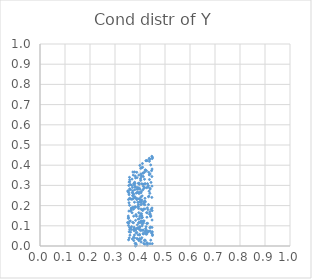
| Category | Series 0 |
|---|---|
| -100.0 | -100 |
| -100.0 | -100 |
| 0.3984788786961354 | 0.055 |
| -100.0 | -100 |
| -100.0 | -100 |
| -100.0 | -100 |
| -100.0 | -100 |
| -100.0 | -100 |
| -100.0 | -100 |
| -100.0 | -100 |
| -100.0 | -100 |
| -100.0 | -100 |
| -100.0 | -100 |
| -100.0 | -100 |
| -100.0 | -100 |
| -100.0 | -100 |
| -100.0 | -100 |
| -100.0 | -100 |
| 0.38183788734739155 | 0.291 |
| -100.0 | -100 |
| -100.0 | -100 |
| -100.0 | -100 |
| -100.0 | -100 |
| -100.0 | -100 |
| -100.0 | -100 |
| -100.0 | -100 |
| -100.0 | -100 |
| -100.0 | -100 |
| -100.0 | -100 |
| 0.44981181764780886 | 0.439 |
| -100.0 | -100 |
| -100.0 | -100 |
| -100.0 | -100 |
| -100.0 | -100 |
| -100.0 | -100 |
| -100.0 | -100 |
| -100.0 | -100 |
| -100.0 | -100 |
| -100.0 | -100 |
| -100.0 | -100 |
| -100.0 | -100 |
| -100.0 | -100 |
| -100.0 | -100 |
| -100.0 | -100 |
| -100.0 | -100 |
| -100.0 | -100 |
| -100.0 | -100 |
| -100.0 | -100 |
| -100.0 | -100 |
| -100.0 | -100 |
| -100.0 | -100 |
| -100.0 | -100 |
| -100.0 | -100 |
| -100.0 | -100 |
| -100.0 | -100 |
| -100.0 | -100 |
| -100.0 | -100 |
| 0.3764222153094099 | 0.092 |
| -100.0 | -100 |
| 0.43538564906960464 | 0.247 |
| -100.0 | -100 |
| -100.0 | -100 |
| -100.0 | -100 |
| 0.3986104908175241 | 0.265 |
| -100.0 | -100 |
| 0.42934469417904586 | 0.164 |
| -100.0 | -100 |
| -100.0 | -100 |
| -100.0 | -100 |
| -100.0 | -100 |
| -100.0 | -100 |
| -100.0 | -100 |
| -100.0 | -100 |
| -100.0 | -100 |
| -100.0 | -100 |
| -100.0 | -100 |
| -100.0 | -100 |
| -100.0 | -100 |
| -100.0 | -100 |
| -100.0 | -100 |
| -100.0 | -100 |
| -100.0 | -100 |
| -100.0 | -100 |
| 0.43119849776570507 | 0.012 |
| -100.0 | -100 |
| -100.0 | -100 |
| -100.0 | -100 |
| -100.0 | -100 |
| -100.0 | -100 |
| 0.4130955512670461 | 0.06 |
| -100.0 | -100 |
| -100.0 | -100 |
| -100.0 | -100 |
| 0.39761539218402175 | 0.136 |
| -100.0 | -100 |
| -100.0 | -100 |
| -100.0 | -100 |
| -100.0 | -100 |
| -100.0 | -100 |
| 0.37852267365319336 | 0.366 |
| -100.0 | -100 |
| -100.0 | -100 |
| -100.0 | -100 |
| -100.0 | -100 |
| -100.0 | -100 |
| -100.0 | -100 |
| -100.0 | -100 |
| -100.0 | -100 |
| -100.0 | -100 |
| -100.0 | -100 |
| -100.0 | -100 |
| -100.0 | -100 |
| 0.42733392534526826 | 0.017 |
| -100.0 | -100 |
| 0.35342719909961395 | 0.137 |
| -100.0 | -100 |
| -100.0 | -100 |
| -100.0 | -100 |
| -100.0 | -100 |
| -100.0 | -100 |
| 0.35132920341745844 | 0.273 |
| 0.3819134903836072 | 0.079 |
| -100.0 | -100 |
| -100.0 | -100 |
| -100.0 | -100 |
| -100.0 | -100 |
| 0.4040282498048947 | 0.264 |
| -100.0 | -100 |
| -100.0 | -100 |
| -100.0 | -100 |
| -100.0 | -100 |
| 0.4182765924295724 | 0.366 |
| -100.0 | -100 |
| -100.0 | -100 |
| -100.0 | -100 |
| -100.0 | -100 |
| -100.0 | -100 |
| 0.3611555429300717 | 0.124 |
| -100.0 | -100 |
| -100.0 | -100 |
| -100.0 | -100 |
| -100.0 | -100 |
| -100.0 | -100 |
| -100.0 | -100 |
| -100.0 | -100 |
| 0.4192288915169152 | 0.009 |
| -100.0 | -100 |
| 0.36732892085977253 | 0.231 |
| -100.0 | -100 |
| -100.0 | -100 |
| 0.4333009480636858 | 0.299 |
| -100.0 | -100 |
| -100.0 | -100 |
| 0.38901179366630356 | 0.088 |
| -100.0 | -100 |
| -100.0 | -100 |
| -100.0 | -100 |
| -100.0 | -100 |
| -100.0 | -100 |
| -100.0 | -100 |
| -100.0 | -100 |
| 0.3822358598220085 | 0.337 |
| -100.0 | -100 |
| -100.0 | -100 |
| -100.0 | -100 |
| -100.0 | -100 |
| -100.0 | -100 |
| -100.0 | -100 |
| -100.0 | -100 |
| -100.0 | -100 |
| -100.0 | -100 |
| -100.0 | -100 |
| -100.0 | -100 |
| -100.0 | -100 |
| -100.0 | -100 |
| 0.4058019486643727 | 0.35 |
| -100.0 | -100 |
| -100.0 | -100 |
| -100.0 | -100 |
| -100.0 | -100 |
| -100.0 | -100 |
| -100.0 | -100 |
| -100.0 | -100 |
| -100.0 | -100 |
| -100.0 | -100 |
| -100.0 | -100 |
| -100.0 | -100 |
| 0.42042175091712386 | 0.376 |
| -100.0 | -100 |
| -100.0 | -100 |
| -100.0 | -100 |
| -100.0 | -100 |
| -100.0 | -100 |
| -100.0 | -100 |
| -100.0 | -100 |
| -100.0 | -100 |
| -100.0 | -100 |
| -100.0 | -100 |
| -100.0 | -100 |
| -100.0 | -100 |
| -100.0 | -100 |
| 0.4025875365166094 | 0.159 |
| -100.0 | -100 |
| -100.0 | -100 |
| -100.0 | -100 |
| 0.4194444494610209 | 0.204 |
| -100.0 | -100 |
| -100.0 | -100 |
| -100.0 | -100 |
| -100.0 | -100 |
| -100.0 | -100 |
| -100.0 | -100 |
| -100.0 | -100 |
| -100.0 | -100 |
| -100.0 | -100 |
| -100.0 | -100 |
| 0.4299523964220757 | 0.308 |
| -100.0 | -100 |
| -100.0 | -100 |
| -100.0 | -100 |
| -100.0 | -100 |
| -100.0 | -100 |
| -100.0 | -100 |
| -100.0 | -100 |
| 0.39345051176621704 | 0.205 |
| -100.0 | -100 |
| -100.0 | -100 |
| -100.0 | -100 |
| -100.0 | -100 |
| 0.40488263397348767 | 0.02 |
| -100.0 | -100 |
| -100.0 | -100 |
| -100.0 | -100 |
| -100.0 | -100 |
| -100.0 | -100 |
| -100.0 | -100 |
| -100.0 | -100 |
| -100.0 | -100 |
| 0.3855236015125614 | 0.262 |
| -100.0 | -100 |
| 0.37402754642486036 | 0.182 |
| -100.0 | -100 |
| -100.0 | -100 |
| -100.0 | -100 |
| 0.43310127608439375 | 0.07 |
| -100.0 | -100 |
| -100.0 | -100 |
| -100.0 | -100 |
| -100.0 | -100 |
| -100.0 | -100 |
| -100.0 | -100 |
| -100.0 | -100 |
| 0.440050142944034 | 0.012 |
| -100.0 | -100 |
| -100.0 | -100 |
| 0.36457062461364764 | 0.178 |
| -100.0 | -100 |
| -100.0 | -100 |
| -100.0 | -100 |
| -100.0 | -100 |
| -100.0 | -100 |
| 0.4362612445817946 | 0.271 |
| 0.3811538403983896 | 0.293 |
| -100.0 | -100 |
| -100.0 | -100 |
| -100.0 | -100 |
| -100.0 | -100 |
| 0.4086707386680841 | 0.248 |
| -100.0 | -100 |
| -100.0 | -100 |
| 0.40260852835461924 | 0.117 |
| -100.0 | -100 |
| -100.0 | -100 |
| -100.0 | -100 |
| -100.0 | -100 |
| -100.0 | -100 |
| -100.0 | -100 |
| -100.0 | -100 |
| -100.0 | -100 |
| -100.0 | -100 |
| -100.0 | -100 |
| -100.0 | -100 |
| 0.3876938347231472 | 0.037 |
| -100.0 | -100 |
| -100.0 | -100 |
| -100.0 | -100 |
| -100.0 | -100 |
| -100.0 | -100 |
| -100.0 | -100 |
| -100.0 | -100 |
| -100.0 | -100 |
| -100.0 | -100 |
| -100.0 | -100 |
| -100.0 | -100 |
| -100.0 | -100 |
| -100.0 | -100 |
| -100.0 | -100 |
| -100.0 | -100 |
| -100.0 | -100 |
| -100.0 | -100 |
| -100.0 | -100 |
| -100.0 | -100 |
| -100.0 | -100 |
| -100.0 | -100 |
| -100.0 | -100 |
| -100.0 | -100 |
| -100.0 | -100 |
| -100.0 | -100 |
| -100.0 | -100 |
| -100.0 | -100 |
| -100.0 | -100 |
| 0.4051011178396613 | 0.27 |
| -100.0 | -100 |
| -100.0 | -100 |
| -100.0 | -100 |
| -100.0 | -100 |
| -100.0 | -100 |
| -100.0 | -100 |
| -100.0 | -100 |
| -100.0 | -100 |
| -100.0 | -100 |
| -100.0 | -100 |
| -100.0 | -100 |
| -100.0 | -100 |
| -100.0 | -100 |
| -100.0 | -100 |
| -100.0 | -100 |
| -100.0 | -100 |
| 0.44135163790208554 | 0.158 |
| -100.0 | -100 |
| -100.0 | -100 |
| -100.0 | -100 |
| 0.3539405311824003 | 0.23 |
| -100.0 | -100 |
| -100.0 | -100 |
| -100.0 | -100 |
| -100.0 | -100 |
| -100.0 | -100 |
| -100.0 | -100 |
| -100.0 | -100 |
| -100.0 | -100 |
| -100.0 | -100 |
| -100.0 | -100 |
| -100.0 | -100 |
| 0.42930797773132146 | 0.189 |
| 0.37649560663048376 | 0.076 |
| -100.0 | -100 |
| -100.0 | -100 |
| -100.0 | -100 |
| -100.0 | -100 |
| -100.0 | -100 |
| -100.0 | -100 |
| -100.0 | -100 |
| 0.37954052763918833 | 0.244 |
| -100.0 | -100 |
| -100.0 | -100 |
| -100.0 | -100 |
| -100.0 | -100 |
| -100.0 | -100 |
| -100.0 | -100 |
| -100.0 | -100 |
| -100.0 | -100 |
| -100.0 | -100 |
| -100.0 | -100 |
| -100.0 | -100 |
| -100.0 | -100 |
| -100.0 | -100 |
| -100.0 | -100 |
| 0.44043231415435946 | 0.356 |
| -100.0 | -100 |
| -100.0 | -100 |
| -100.0 | -100 |
| -100.0 | -100 |
| -100.0 | -100 |
| 0.4383119960336511 | 0.157 |
| -100.0 | -100 |
| -100.0 | -100 |
| -100.0 | -100 |
| 0.4115910105710997 | 0.077 |
| -100.0 | -100 |
| -100.0 | -100 |
| -100.0 | -100 |
| -100.0 | -100 |
| -100.0 | -100 |
| -100.0 | -100 |
| -100.0 | -100 |
| 0.39816789398510233 | 0.233 |
| -100.0 | -100 |
| -100.0 | -100 |
| -100.0 | -100 |
| -100.0 | -100 |
| -100.0 | -100 |
| -100.0 | -100 |
| -100.0 | -100 |
| -100.0 | -100 |
| -100.0 | -100 |
| -100.0 | -100 |
| -100.0 | -100 |
| -100.0 | -100 |
| -100.0 | -100 |
| -100.0 | -100 |
| -100.0 | -100 |
| 0.3945240547652642 | 0.115 |
| -100.0 | -100 |
| -100.0 | -100 |
| -100.0 | -100 |
| -100.0 | -100 |
| -100.0 | -100 |
| 0.419542626368824 | 0.069 |
| -100.0 | -100 |
| -100.0 | -100 |
| -100.0 | -100 |
| -100.0 | -100 |
| -100.0 | -100 |
| -100.0 | -100 |
| -100.0 | -100 |
| -100.0 | -100 |
| -100.0 | -100 |
| -100.0 | -100 |
| -100.0 | -100 |
| -100.0 | -100 |
| -100.0 | -100 |
| -100.0 | -100 |
| -100.0 | -100 |
| -100.0 | -100 |
| -100.0 | -100 |
| -100.0 | -100 |
| -100.0 | -100 |
| -100.0 | -100 |
| -100.0 | -100 |
| -100.0 | -100 |
| -100.0 | -100 |
| -100.0 | -100 |
| -100.0 | -100 |
| -100.0 | -100 |
| -100.0 | -100 |
| -100.0 | -100 |
| -100.0 | -100 |
| -100.0 | -100 |
| -100.0 | -100 |
| 0.39584914282997885 | 0.234 |
| -100.0 | -100 |
| -100.0 | -100 |
| -100.0 | -100 |
| -100.0 | -100 |
| -100.0 | -100 |
| 0.38046956036724167 | 0.013 |
| -100.0 | -100 |
| -100.0 | -100 |
| -100.0 | -100 |
| -100.0 | -100 |
| -100.0 | -100 |
| -100.0 | -100 |
| -100.0 | -100 |
| -100.0 | -100 |
| 0.3966693705280685 | 0.117 |
| -100.0 | -100 |
| -100.0 | -100 |
| -100.0 | -100 |
| 0.3557229659405544 | 0.262 |
| -100.0 | -100 |
| -100.0 | -100 |
| -100.0 | -100 |
| -100.0 | -100 |
| -100.0 | -100 |
| -100.0 | -100 |
| -100.0 | -100 |
| 0.3531137837585957 | 0.148 |
| -100.0 | -100 |
| 0.4096356634086432 | 0.408 |
| -100.0 | -100 |
| -100.0 | -100 |
| -100.0 | -100 |
| -100.0 | -100 |
| -100.0 | -100 |
| -100.0 | -100 |
| -100.0 | -100 |
| -100.0 | -100 |
| -100.0 | -100 |
| -100.0 | -100 |
| -100.0 | -100 |
| -100.0 | -100 |
| 0.4499613863519254 | 0.057 |
| -100.0 | -100 |
| -100.0 | -100 |
| -100.0 | -100 |
| -100.0 | -100 |
| 0.41763707985634557 | 0.027 |
| -100.0 | -100 |
| -100.0 | -100 |
| -100.0 | -100 |
| 0.3543201400672933 | 0.031 |
| -100.0 | -100 |
| -100.0 | -100 |
| 0.3589610226025929 | 0.081 |
| -100.0 | -100 |
| -100.0 | -100 |
| -100.0 | -100 |
| -100.0 | -100 |
| -100.0 | -100 |
| -100.0 | -100 |
| -100.0 | -100 |
| -100.0 | -100 |
| -100.0 | -100 |
| 0.3872492360251891 | 0.365 |
| -100.0 | -100 |
| -100.0 | -100 |
| -100.0 | -100 |
| -100.0 | -100 |
| -100.0 | -100 |
| -100.0 | -100 |
| -100.0 | -100 |
| -100.0 | -100 |
| -100.0 | -100 |
| -100.0 | -100 |
| -100.0 | -100 |
| -100.0 | -100 |
| -100.0 | -100 |
| 0.4107633832123716 | 0.176 |
| -100.0 | -100 |
| -100.0 | -100 |
| -100.0 | -100 |
| 0.40739519582220307 | 0.041 |
| -100.0 | -100 |
| -100.0 | -100 |
| -100.0 | -100 |
| -100.0 | -100 |
| -100.0 | -100 |
| -100.0 | -100 |
| -100.0 | -100 |
| -100.0 | -100 |
| -100.0 | -100 |
| -100.0 | -100 |
| 0.36409236822058066 | 0.176 |
| -100.0 | -100 |
| -100.0 | -100 |
| 0.3548166404507386 | 0.112 |
| -100.0 | -100 |
| -100.0 | -100 |
| -100.0 | -100 |
| -100.0 | -100 |
| -100.0 | -100 |
| -100.0 | -100 |
| -100.0 | -100 |
| -100.0 | -100 |
| -100.0 | -100 |
| -100.0 | -100 |
| 0.40592103161428483 | 0.22 |
| -100.0 | -100 |
| -100.0 | -100 |
| -100.0 | -100 |
| -100.0 | -100 |
| -100.0 | -100 |
| -100.0 | -100 |
| -100.0 | -100 |
| -100.0 | -100 |
| -100.0 | -100 |
| -100.0 | -100 |
| 0.39526563132838244 | 0.351 |
| -100.0 | -100 |
| -100.0 | -100 |
| -100.0 | -100 |
| -100.0 | -100 |
| -100.0 | -100 |
| -100.0 | -100 |
| -100.0 | -100 |
| -100.0 | -100 |
| -100.0 | -100 |
| -100.0 | -100 |
| -100.0 | -100 |
| -100.0 | -100 |
| -100.0 | -100 |
| -100.0 | -100 |
| 0.35648639021604867 | 0.316 |
| -100.0 | -100 |
| 0.41627736120799985 | 0.124 |
| -100.0 | -100 |
| -100.0 | -100 |
| -100.0 | -100 |
| -100.0 | -100 |
| -100.0 | -100 |
| -100.0 | -100 |
| -100.0 | -100 |
| -100.0 | -100 |
| -100.0 | -100 |
| -100.0 | -100 |
| 0.3714442688569879 | 0.366 |
| 0.3567560020673838 | 0.07 |
| -100.0 | -100 |
| -100.0 | -100 |
| -100.0 | -100 |
| -100.0 | -100 |
| -100.0 | -100 |
| -100.0 | -100 |
| -100.0 | -100 |
| -100.0 | -100 |
| -100.0 | -100 |
| -100.0 | -100 |
| -100.0 | -100 |
| -100.0 | -100 |
| -100.0 | -100 |
| -100.0 | -100 |
| -100.0 | -100 |
| -100.0 | -100 |
| -100.0 | -100 |
| -100.0 | -100 |
| -100.0 | -100 |
| -100.0 | -100 |
| -100.0 | -100 |
| -100.0 | -100 |
| -100.0 | -100 |
| -100.0 | -100 |
| -100.0 | -100 |
| -100.0 | -100 |
| -100.0 | -100 |
| -100.0 | -100 |
| -100.0 | -100 |
| -100.0 | -100 |
| -100.0 | -100 |
| -100.0 | -100 |
| -100.0 | -100 |
| -100.0 | -100 |
| -100.0 | -100 |
| 0.415099911584044 | 0.013 |
| -100.0 | -100 |
| 0.4482151463092019 | 0.381 |
| -100.0 | -100 |
| -100.0 | -100 |
| -100.0 | -100 |
| -100.0 | -100 |
| -100.0 | -100 |
| -100.0 | -100 |
| -100.0 | -100 |
| 0.35837645761405423 | 0.236 |
| -100.0 | -100 |
| -100.0 | -100 |
| -100.0 | -100 |
| -100.0 | -100 |
| -100.0 | -100 |
| -100.0 | -100 |
| 0.41428141133515495 | 0.208 |
| -100.0 | -100 |
| -100.0 | -100 |
| -100.0 | -100 |
| -100.0 | -100 |
| -100.0 | -100 |
| 0.37536282309945157 | 0.257 |
| -100.0 | -100 |
| -100.0 | -100 |
| -100.0 | -100 |
| -100.0 | -100 |
| -100.0 | -100 |
| 0.35914195601693033 | 0.284 |
| -100.0 | -100 |
| -100.0 | -100 |
| -100.0 | -100 |
| 0.42600881845304384 | 0.372 |
| -100.0 | -100 |
| 0.439533195655169 | 0.285 |
| -100.0 | -100 |
| -100.0 | -100 |
| -100.0 | -100 |
| -100.0 | -100 |
| -100.0 | -100 |
| -100.0 | -100 |
| -100.0 | -100 |
| -100.0 | -100 |
| -100.0 | -100 |
| -100.0 | -100 |
| -100.0 | -100 |
| -100.0 | -100 |
| -100.0 | -100 |
| -100.0 | -100 |
| -100.0 | -100 |
| -100.0 | -100 |
| -100.0 | -100 |
| -100.0 | -100 |
| -100.0 | -100 |
| 0.447552998036823 | 0.344 |
| -100.0 | -100 |
| -100.0 | -100 |
| 0.35834015206539627 | 0.123 |
| -100.0 | -100 |
| -100.0 | -100 |
| -100.0 | -100 |
| 0.3621487687972339 | 0.174 |
| -100.0 | -100 |
| -100.0 | -100 |
| -100.0 | -100 |
| -100.0 | -100 |
| 0.38601340774203186 | 0.147 |
| -100.0 | -100 |
| -100.0 | -100 |
| 0.44912752240569254 | 0.433 |
| -100.0 | -100 |
| -100.0 | -100 |
| -100.0 | -100 |
| -100.0 | -100 |
| -100.0 | -100 |
| -100.0 | -100 |
| 0.38121842330434963 | 0.347 |
| -100.0 | -100 |
| -100.0 | -100 |
| -100.0 | -100 |
| -100.0 | -100 |
| -100.0 | -100 |
| -100.0 | -100 |
| -100.0 | -100 |
| -100.0 | -100 |
| -100.0 | -100 |
| -100.0 | -100 |
| -100.0 | -100 |
| -100.0 | -100 |
| -100.0 | -100 |
| -100.0 | -100 |
| -100.0 | -100 |
| -100.0 | -100 |
| -100.0 | -100 |
| -100.0 | -100 |
| 0.3881133514652916 | 0.264 |
| -100.0 | -100 |
| -100.0 | -100 |
| 0.4481050547569533 | 0.092 |
| -100.0 | -100 |
| -100.0 | -100 |
| -100.0 | -100 |
| -100.0 | -100 |
| -100.0 | -100 |
| -100.0 | -100 |
| 0.4489242780853723 | 0.012 |
| -100.0 | -100 |
| -100.0 | -100 |
| 0.3750154381992795 | 0.31 |
| 0.3587700878064274 | 0.328 |
| 0.3807962904367137 | 0.194 |
| -100.0 | -100 |
| -100.0 | -100 |
| -100.0 | -100 |
| -100.0 | -100 |
| -100.0 | -100 |
| -100.0 | -100 |
| 0.354305491066531 | 0.274 |
| -100.0 | -100 |
| -100.0 | -100 |
| -100.0 | -100 |
| -100.0 | -100 |
| -100.0 | -100 |
| -100.0 | -100 |
| -100.0 | -100 |
| -100.0 | -100 |
| 0.3680855988617132 | 0.331 |
| -100.0 | -100 |
| -100.0 | -100 |
| -100.0 | -100 |
| -100.0 | -100 |
| -100.0 | -100 |
| -100.0 | -100 |
| -100.0 | -100 |
| -100.0 | -100 |
| -100.0 | -100 |
| -100.0 | -100 |
| -100.0 | -100 |
| -100.0 | -100 |
| -100.0 | -100 |
| -100.0 | -100 |
| 0.4113973920932219 | 0.123 |
| -100.0 | -100 |
| -100.0 | -100 |
| -100.0 | -100 |
| 0.35033903251277676 | 0.116 |
| 0.36484288358911776 | 0.187 |
| -100.0 | -100 |
| -100.0 | -100 |
| -100.0 | -100 |
| -100.0 | -100 |
| -100.0 | -100 |
| -100.0 | -100 |
| -100.0 | -100 |
| -100.0 | -100 |
| -100.0 | -100 |
| -100.0 | -100 |
| 0.4269250243439454 | 0.112 |
| -100.0 | -100 |
| -100.0 | -100 |
| -100.0 | -100 |
| -100.0 | -100 |
| -100.0 | -100 |
| -100.0 | -100 |
| -100.0 | -100 |
| 0.4480010338520881 | 0.188 |
| -100.0 | -100 |
| -100.0 | -100 |
| -100.0 | -100 |
| -100.0 | -100 |
| -100.0 | -100 |
| -100.0 | -100 |
| -100.0 | -100 |
| -100.0 | -100 |
| -100.0 | -100 |
| -100.0 | -100 |
| -100.0 | -100 |
| -100.0 | -100 |
| 0.39597897920913483 | 0.26 |
| -100.0 | -100 |
| -100.0 | -100 |
| -100.0 | -100 |
| -100.0 | -100 |
| -100.0 | -100 |
| -100.0 | -100 |
| -100.0 | -100 |
| -100.0 | -100 |
| -100.0 | -100 |
| -100.0 | -100 |
| -100.0 | -100 |
| -100.0 | -100 |
| -100.0 | -100 |
| -100.0 | -100 |
| -100.0 | -100 |
| -100.0 | -100 |
| -100.0 | -100 |
| -100.0 | -100 |
| -100.0 | -100 |
| -100.0 | -100 |
| -100.0 | -100 |
| -100.0 | -100 |
| -100.0 | -100 |
| -100.0 | -100 |
| -100.0 | -100 |
| -100.0 | -100 |
| -100.0 | -100 |
| -100.0 | -100 |
| -100.0 | -100 |
| -100.0 | -100 |
| -100.0 | -100 |
| -100.0 | -100 |
| -100.0 | -100 |
| -100.0 | -100 |
| -100.0 | -100 |
| -100.0 | -100 |
| -100.0 | -100 |
| -100.0 | -100 |
| -100.0 | -100 |
| -100.0 | -100 |
| -100.0 | -100 |
| -100.0 | -100 |
| -100.0 | -100 |
| -100.0 | -100 |
| -100.0 | -100 |
| -100.0 | -100 |
| -100.0 | -100 |
| -100.0 | -100 |
| 0.35505058509651166 | 0.299 |
| -100.0 | -100 |
| -100.0 | -100 |
| -100.0 | -100 |
| -100.0 | -100 |
| -100.0 | -100 |
| -100.0 | -100 |
| -100.0 | -100 |
| -100.0 | -100 |
| -100.0 | -100 |
| -100.0 | -100 |
| -100.0 | -100 |
| 0.3628860077193099 | 0.089 |
| 0.3709855242475689 | 0.25 |
| 0.37795238958678146 | 0.191 |
| 0.4315313368541588 | 0.18 |
| -100.0 | -100 |
| -100.0 | -100 |
| -100.0 | -100 |
| -100.0 | -100 |
| -100.0 | -100 |
| 0.4076828116360486 | 0.118 |
| -100.0 | -100 |
| -100.0 | -100 |
| -100.0 | -100 |
| -100.0 | -100 |
| 0.40448122931332287 | 0.183 |
| -100.0 | -100 |
| -100.0 | -100 |
| -100.0 | -100 |
| -100.0 | -100 |
| -100.0 | -100 |
| -100.0 | -100 |
| 0.3815043384819179 | 0.001 |
| -100.0 | -100 |
| -100.0 | -100 |
| -100.0 | -100 |
| -100.0 | -100 |
| -100.0 | -100 |
| -100.0 | -100 |
| -100.0 | -100 |
| -100.0 | -100 |
| -100.0 | -100 |
| -100.0 | -100 |
| -100.0 | -100 |
| -100.0 | -100 |
| 0.44316723318466344 | 0.029 |
| -100.0 | -100 |
| -100.0 | -100 |
| -100.0 | -100 |
| -100.0 | -100 |
| -100.0 | -100 |
| 0.4145766489600815 | 0.183 |
| -100.0 | -100 |
| -100.0 | -100 |
| -100.0 | -100 |
| -100.0 | -100 |
| -100.0 | -100 |
| -100.0 | -100 |
| -100.0 | -100 |
| -100.0 | -100 |
| -100.0 | -100 |
| -100.0 | -100 |
| 0.3538702726611439 | 0.102 |
| -100.0 | -100 |
| -100.0 | -100 |
| -100.0 | -100 |
| -100.0 | -100 |
| -100.0 | -100 |
| -100.0 | -100 |
| -100.0 | -100 |
| -100.0 | -100 |
| -100.0 | -100 |
| -100.0 | -100 |
| -100.0 | -100 |
| -100.0 | -100 |
| -100.0 | -100 |
| -100.0 | -100 |
| -100.0 | -100 |
| -100.0 | -100 |
| -100.0 | -100 |
| -100.0 | -100 |
| -100.0 | -100 |
| -100.0 | -100 |
| -100.0 | -100 |
| 0.42543800229766815 | 0.422 |
| -100.0 | -100 |
| -100.0 | -100 |
| -100.0 | -100 |
| -100.0 | -100 |
| -100.0 | -100 |
| -100.0 | -100 |
| -100.0 | -100 |
| -100.0 | -100 |
| -100.0 | -100 |
| -100.0 | -100 |
| -100.0 | -100 |
| -100.0 | -100 |
| -100.0 | -100 |
| -100.0 | -100 |
| -100.0 | -100 |
| -100.0 | -100 |
| -100.0 | -100 |
| -100.0 | -100 |
| -100.0 | -100 |
| -100.0 | -100 |
| -100.0 | -100 |
| -100.0 | -100 |
| -100.0 | -100 |
| -100.0 | -100 |
| -100.0 | -100 |
| -100.0 | -100 |
| 0.36115369142999965 | 0.304 |
| -100.0 | -100 |
| -100.0 | -100 |
| -100.0 | -100 |
| -100.0 | -100 |
| -100.0 | -100 |
| -100.0 | -100 |
| -100.0 | -100 |
| -100.0 | -100 |
| -100.0 | -100 |
| -100.0 | -100 |
| -100.0 | -100 |
| -100.0 | -100 |
| -100.0 | -100 |
| -100.0 | -100 |
| -100.0 | -100 |
| -100.0 | -100 |
| -100.0 | -100 |
| -100.0 | -100 |
| -100.0 | -100 |
| -100.0 | -100 |
| -100.0 | -100 |
| -100.0 | -100 |
| -100.0 | -100 |
| -100.0 | -100 |
| -100.0 | -100 |
| -100.0 | -100 |
| 0.4020128651556827 | 0.333 |
| -100.0 | -100 |
| -100.0 | -100 |
| -100.0 | -100 |
| -100.0 | -100 |
| -100.0 | -100 |
| 0.41328383212127706 | 0.344 |
| -100.0 | -100 |
| -100.0 | -100 |
| -100.0 | -100 |
| -100.0 | -100 |
| -100.0 | -100 |
| -100.0 | -100 |
| -100.0 | -100 |
| -100.0 | -100 |
| -100.0 | -100 |
| -100.0 | -100 |
| 0.3683324548639334 | 0.165 |
| -100.0 | -100 |
| -100.0 | -100 |
| -100.0 | -100 |
| -100.0 | -100 |
| -100.0 | -100 |
| -100.0 | -100 |
| -100.0 | -100 |
| -100.0 | -100 |
| -100.0 | -100 |
| -100.0 | -100 |
| -100.0 | -100 |
| 0.419397314221565 | 0.184 |
| 0.3980071701273502 | 0.095 |
| 0.378231411539917 | 0.04 |
| -100.0 | -100 |
| -100.0 | -100 |
| -100.0 | -100 |
| -100.0 | -100 |
| -100.0 | -100 |
| -100.0 | -100 |
| -100.0 | -100 |
| -100.0 | -100 |
| 0.40742928342665186 | 0.308 |
| -100.0 | -100 |
| -100.0 | -100 |
| -100.0 | -100 |
| -100.0 | -100 |
| -100.0 | -100 |
| -100.0 | -100 |
| -100.0 | -100 |
| 0.37032689640993466 | 0.29 |
| -100.0 | -100 |
| -100.0 | -100 |
| -100.0 | -100 |
| -100.0 | -100 |
| -100.0 | -100 |
| -100.0 | -100 |
| -100.0 | -100 |
| -100.0 | -100 |
| -100.0 | -100 |
| -100.0 | -100 |
| -100.0 | -100 |
| -100.0 | -100 |
| -100.0 | -100 |
| 0.3540866600449434 | 0.14 |
| -100.0 | -100 |
| 0.4213282639254168 | 0.028 |
| -100.0 | -100 |
| -100.0 | -100 |
| -100.0 | -100 |
| -100.0 | -100 |
| -100.0 | -100 |
| -100.0 | -100 |
| -100.0 | -100 |
| -100.0 | -100 |
| -100.0 | -100 |
| -100.0 | -100 |
| 0.39339475339041674 | 0.194 |
| -100.0 | -100 |
| -100.0 | -100 |
| -100.0 | -100 |
| -100.0 | -100 |
| -100.0 | -100 |
| -100.0 | -100 |
| -100.0 | -100 |
| -100.0 | -100 |
| -100.0 | -100 |
| -100.0 | -100 |
| -100.0 | -100 |
| -100.0 | -100 |
| -100.0 | -100 |
| -100.0 | -100 |
| -100.0 | -100 |
| 0.35869802011967844 | 0.318 |
| -100.0 | -100 |
| -100.0 | -100 |
| -100.0 | -100 |
| -100.0 | -100 |
| -100.0 | -100 |
| 0.3854388735498616 | 0.005 |
| -100.0 | -100 |
| -100.0 | -100 |
| -100.0 | -100 |
| -100.0 | -100 |
| -100.0 | -100 |
| -100.0 | -100 |
| -100.0 | -100 |
| -100.0 | -100 |
| -100.0 | -100 |
| -100.0 | -100 |
| -100.0 | -100 |
| 0.37767936900250554 | 0.088 |
| -100.0 | -100 |
| -100.0 | -100 |
| -100.0 | -100 |
| -100.0 | -100 |
| -100.0 | -100 |
| -100.0 | -100 |
| -100.0 | -100 |
| -100.0 | -100 |
| -100.0 | -100 |
| -100.0 | -100 |
| -100.0 | -100 |
| -100.0 | -100 |
| -100.0 | -100 |
| -100.0 | -100 |
| -100.0 | -100 |
| -100.0 | -100 |
| 0.3928332606375248 | 0.197 |
| -100.0 | -100 |
| -100.0 | -100 |
| 0.41805832259307085 | 0.331 |
| -100.0 | -100 |
| -100.0 | -100 |
| -100.0 | -100 |
| -100.0 | -100 |
| -100.0 | -100 |
| -100.0 | -100 |
| -100.0 | -100 |
| -100.0 | -100 |
| 0.3710857534269848 | 0.248 |
| -100.0 | -100 |
| 0.4407981805223331 | 0.282 |
| -100.0 | -100 |
| -100.0 | -100 |
| -100.0 | -100 |
| -100.0 | -100 |
| -100.0 | -100 |
| -100.0 | -100 |
| 0.3597261948462247 | 0.054 |
| -100.0 | -100 |
| -100.0 | -100 |
| -100.0 | -100 |
| -100.0 | -100 |
| 0.39666586968639694 | 0.311 |
| -100.0 | -100 |
| -100.0 | -100 |
| -100.0 | -100 |
| -100.0 | -100 |
| -100.0 | -100 |
| -100.0 | -100 |
| -100.0 | -100 |
| -100.0 | -100 |
| -100.0 | -100 |
| -100.0 | -100 |
| -100.0 | -100 |
| 0.4265588734516407 | 0.058 |
| -100.0 | -100 |
| -100.0 | -100 |
| -100.0 | -100 |
| -100.0 | -100 |
| -100.0 | -100 |
| -100.0 | -100 |
| -100.0 | -100 |
| -100.0 | -100 |
| -100.0 | -100 |
| -100.0 | -100 |
| -100.0 | -100 |
| 0.37320751638410377 | 0.351 |
| -100.0 | -100 |
| -100.0 | -100 |
| -100.0 | -100 |
| -100.0 | -100 |
| -100.0 | -100 |
| -100.0 | -100 |
| -100.0 | -100 |
| -100.0 | -100 |
| -100.0 | -100 |
| 0.43946291534993087 | 0.261 |
| -100.0 | -100 |
| -100.0 | -100 |
| -100.0 | -100 |
| -100.0 | -100 |
| -100.0 | -100 |
| 0.3570258626496131 | 0.04 |
| -100.0 | -100 |
| -100.0 | -100 |
| -100.0 | -100 |
| -100.0 | -100 |
| -100.0 | -100 |
| -100.0 | -100 |
| -100.0 | -100 |
| -100.0 | -100 |
| -100.0 | -100 |
| -100.0 | -100 |
| -100.0 | -100 |
| -100.0 | -100 |
| -100.0 | -100 |
| -100.0 | -100 |
| -100.0 | -100 |
| -100.0 | -100 |
| 0.41892426215282497 | 0.029 |
| -100.0 | -100 |
| 0.3664169758313296 | 0.082 |
| -100.0 | -100 |
| -100.0 | -100 |
| -100.0 | -100 |
| -100.0 | -100 |
| -100.0 | -100 |
| -100.0 | -100 |
| -100.0 | -100 |
| -100.0 | -100 |
| -100.0 | -100 |
| -100.0 | -100 |
| -100.0 | -100 |
| -100.0 | -100 |
| -100.0 | -100 |
| -100.0 | -100 |
| -100.0 | -100 |
| -100.0 | -100 |
| -100.0 | -100 |
| -100.0 | -100 |
| -100.0 | -100 |
| -100.0 | -100 |
| -100.0 | -100 |
| -100.0 | -100 |
| -100.0 | -100 |
| -100.0 | -100 |
| 0.37791563953387275 | 0.217 |
| -100.0 | -100 |
| -100.0 | -100 |
| -100.0 | -100 |
| -100.0 | -100 |
| -100.0 | -100 |
| -100.0 | -100 |
| -100.0 | -100 |
| 0.4474044355289639 | 0.24 |
| -100.0 | -100 |
| -100.0 | -100 |
| -100.0 | -100 |
| -100.0 | -100 |
| -100.0 | -100 |
| -100.0 | -100 |
| -100.0 | -100 |
| -100.0 | -100 |
| -100.0 | -100 |
| -100.0 | -100 |
| -100.0 | -100 |
| -100.0 | -100 |
| 0.44373838082620265 | 0.148 |
| -100.0 | -100 |
| -100.0 | -100 |
| -100.0 | -100 |
| -100.0 | -100 |
| -100.0 | -100 |
| -100.0 | -100 |
| -100.0 | -100 |
| -100.0 | -100 |
| -100.0 | -100 |
| -100.0 | -100 |
| -100.0 | -100 |
| 0.4071864750345332 | 0.228 |
| 0.3714790747942155 | 0.191 |
| -100.0 | -100 |
| -100.0 | -100 |
| -100.0 | -100 |
| -100.0 | -100 |
| -100.0 | -100 |
| -100.0 | -100 |
| 0.39876923552627075 | 0.148 |
| 0.43750868205724835 | 0.419 |
| -100.0 | -100 |
| -100.0 | -100 |
| -100.0 | -100 |
| -100.0 | -100 |
| -100.0 | -100 |
| -100.0 | -100 |
| -100.0 | -100 |
| -100.0 | -100 |
| -100.0 | -100 |
| -100.0 | -100 |
| -100.0 | -100 |
| -100.0 | -100 |
| -100.0 | -100 |
| -100.0 | -100 |
| -100.0 | -100 |
| -100.0 | -100 |
| 0.3705074533904743 | 0.117 |
| -100.0 | -100 |
| -100.0 | -100 |
| -100.0 | -100 |
| -100.0 | -100 |
| -100.0 | -100 |
| -100.0 | -100 |
| -100.0 | -100 |
| -100.0 | -100 |
| -100.0 | -100 |
| -100.0 | -100 |
| -100.0 | -100 |
| -100.0 | -100 |
| -100.0 | -100 |
| -100.0 | -100 |
| -100.0 | -100 |
| -100.0 | -100 |
| -100.0 | -100 |
| -100.0 | -100 |
| -100.0 | -100 |
| -100.0 | -100 |
| -100.0 | -100 |
| -100.0 | -100 |
| -100.0 | -100 |
| -100.0 | -100 |
| 0.4213940858952344 | 0.308 |
| -100.0 | -100 |
| -100.0 | -100 |
| -100.0 | -100 |
| -100.0 | -100 |
| -100.0 | -100 |
| -100.0 | -100 |
| -100.0 | -100 |
| -100.0 | -100 |
| -100.0 | -100 |
| -100.0 | -100 |
| -100.0 | -100 |
| -100.0 | -100 |
| -100.0 | -100 |
| 0.3797899942750387 | 0.309 |
| 0.375711535596277 | 0.082 |
| -100.0 | -100 |
| -100.0 | -100 |
| -100.0 | -100 |
| -100.0 | -100 |
| -100.0 | -100 |
| -100.0 | -100 |
| -100.0 | -100 |
| -100.0 | -100 |
| -100.0 | -100 |
| -100.0 | -100 |
| -100.0 | -100 |
| -100.0 | -100 |
| -100.0 | -100 |
| -100.0 | -100 |
| -100.0 | -100 |
| -100.0 | -100 |
| -100.0 | -100 |
| -100.0 | -100 |
| -100.0 | -100 |
| -100.0 | -100 |
| -100.0 | -100 |
| -100.0 | -100 |
| -100.0 | -100 |
| -100.0 | -100 |
| -100.0 | -100 |
| -100.0 | -100 |
| -100.0 | -100 |
| -100.0 | -100 |
| -100.0 | -100 |
| -100.0 | -100 |
| 0.41294707110089524 | 0.361 |
| -100.0 | -100 |
| -100.0 | -100 |
| -100.0 | -100 |
| -100.0 | -100 |
| -100.0 | -100 |
| -100.0 | -100 |
| 0.37424648644370684 | 0.044 |
| -100.0 | -100 |
| -100.0 | -100 |
| -100.0 | -100 |
| -100.0 | -100 |
| -100.0 | -100 |
| -100.0 | -100 |
| -100.0 | -100 |
| -100.0 | -100 |
| -100.0 | -100 |
| -100.0 | -100 |
| -100.0 | -100 |
| -100.0 | -100 |
| -100.0 | -100 |
| -100.0 | -100 |
| -100.0 | -100 |
| -100.0 | -100 |
| -100.0 | -100 |
| -100.0 | -100 |
| -100.0 | -100 |
| 0.36891390237217947 | 0.264 |
| -100.0 | -100 |
| -100.0 | -100 |
| -100.0 | -100 |
| -100.0 | -100 |
| 0.39141273094356965 | 0.266 |
| -100.0 | -100 |
| -100.0 | -100 |
| -100.0 | -100 |
| -100.0 | -100 |
| -100.0 | -100 |
| -100.0 | -100 |
| -100.0 | -100 |
| -100.0 | -100 |
| -100.0 | -100 |
| -100.0 | -100 |
| -100.0 | -100 |
| -100.0 | -100 |
| -100.0 | -100 |
| -100.0 | -100 |
| 0.42803227959532175 | 0.065 |
| -100.0 | -100 |
| -100.0 | -100 |
| -100.0 | -100 |
| -100.0 | -100 |
| -100.0 | -100 |
| -100.0 | -100 |
| -100.0 | -100 |
| -100.0 | -100 |
| 0.3909544470781362 | 0.216 |
| -100.0 | -100 |
| -100.0 | -100 |
| -100.0 | -100 |
| -100.0 | -100 |
| -100.0 | -100 |
| -100.0 | -100 |
| -100.0 | -100 |
| 0.3777709960550988 | 0.054 |
| -100.0 | -100 |
| -100.0 | -100 |
| -100.0 | -100 |
| -100.0 | -100 |
| -100.0 | -100 |
| -100.0 | -100 |
| -100.0 | -100 |
| -100.0 | -100 |
| -100.0 | -100 |
| -100.0 | -100 |
| -100.0 | -100 |
| -100.0 | -100 |
| -100.0 | -100 |
| -100.0 | -100 |
| -100.0 | -100 |
| -100.0 | -100 |
| -100.0 | -100 |
| -100.0 | -100 |
| -100.0 | -100 |
| -100.0 | -100 |
| -100.0 | -100 |
| -100.0 | -100 |
| -100.0 | -100 |
| -100.0 | -100 |
| -100.0 | -100 |
| 0.3666768095758818 | 0.301 |
| -100.0 | -100 |
| -100.0 | -100 |
| -100.0 | -100 |
| -100.0 | -100 |
| -100.0 | -100 |
| -100.0 | -100 |
| 0.4039731735352581 | 0.205 |
| -100.0 | -100 |
| -100.0 | -100 |
| -100.0 | -100 |
| -100.0 | -100 |
| -100.0 | -100 |
| -100.0 | -100 |
| -100.0 | -100 |
| -100.0 | -100 |
| -100.0 | -100 |
| 0.41390003483815974 | 0.114 |
| -100.0 | -100 |
| 0.35794012421603416 | 0.201 |
| -100.0 | -100 |
| -100.0 | -100 |
| -100.0 | -100 |
| -100.0 | -100 |
| -100.0 | -100 |
| -100.0 | -100 |
| -100.0 | -100 |
| -100.0 | -100 |
| -100.0 | -100 |
| -100.0 | -100 |
| -100.0 | -100 |
| -100.0 | -100 |
| -100.0 | -100 |
| 0.4134226499761373 | 0.124 |
| -100.0 | -100 |
| -100.0 | -100 |
| -100.0 | -100 |
| -100.0 | -100 |
| -100.0 | -100 |
| -100.0 | -100 |
| 0.3929773627920534 | 0.133 |
| -100.0 | -100 |
| -100.0 | -100 |
| -100.0 | -100 |
| -100.0 | -100 |
| 0.3846127819158909 | 0.065 |
| -100.0 | -100 |
| -100.0 | -100 |
| 0.4054378143694082 | 0.342 |
| -100.0 | -100 |
| -100.0 | -100 |
| 0.4386031259823473 | 0.43 |
| -100.0 | -100 |
| -100.0 | -100 |
| -100.0 | -100 |
| -100.0 | -100 |
| -100.0 | -100 |
| -100.0 | -100 |
| -100.0 | -100 |
| -100.0 | -100 |
| -100.0 | -100 |
| -100.0 | -100 |
| -100.0 | -100 |
| -100.0 | -100 |
| 0.37571302177019605 | 0.238 |
| -100.0 | -100 |
| 0.44888372770796214 | 0.071 |
| -100.0 | -100 |
| -100.0 | -100 |
| -100.0 | -100 |
| -100.0 | -100 |
| -100.0 | -100 |
| -100.0 | -100 |
| -100.0 | -100 |
| -100.0 | -100 |
| -100.0 | -100 |
| -100.0 | -100 |
| -100.0 | -100 |
| -100.0 | -100 |
| -100.0 | -100 |
| -100.0 | -100 |
| 0.39628167777514356 | 0.083 |
| -100.0 | -100 |
| -100.0 | -100 |
| -100.0 | -100 |
| -100.0 | -100 |
| -100.0 | -100 |
| 0.4428016271454457 | 0.401 |
| -100.0 | -100 |
| -100.0 | -100 |
| -100.0 | -100 |
| -100.0 | -100 |
| -100.0 | -100 |
| -100.0 | -100 |
| -100.0 | -100 |
| -100.0 | -100 |
| -100.0 | -100 |
| -100.0 | -100 |
| -100.0 | -100 |
| -100.0 | -100 |
| -100.0 | -100 |
| -100.0 | -100 |
| -100.0 | -100 |
| -100.0 | -100 |
| 0.396900537391478 | 0.306 |
| -100.0 | -100 |
| -100.0 | -100 |
| 0.4286722523684161 | 0.423 |
| -100.0 | -100 |
| -100.0 | -100 |
| -100.0 | -100 |
| -100.0 | -100 |
| -100.0 | -100 |
| -100.0 | -100 |
| -100.0 | -100 |
| -100.0 | -100 |
| -100.0 | -100 |
| -100.0 | -100 |
| -100.0 | -100 |
| -100.0 | -100 |
| -100.0 | -100 |
| -100.0 | -100 |
| -100.0 | -100 |
| -100.0 | -100 |
| -100.0 | -100 |
| -100.0 | -100 |
| -100.0 | -100 |
| -100.0 | -100 |
| -100.0 | -100 |
| -100.0 | -100 |
| -100.0 | -100 |
| -100.0 | -100 |
| -100.0 | -100 |
| -100.0 | -100 |
| -100.0 | -100 |
| -100.0 | -100 |
| -100.0 | -100 |
| -100.0 | -100 |
| -100.0 | -100 |
| -100.0 | -100 |
| -100.0 | -100 |
| -100.0 | -100 |
| -100.0 | -100 |
| -100.0 | -100 |
| 0.4219267049135079 | 0.377 |
| -100.0 | -100 |
| -100.0 | -100 |
| -100.0 | -100 |
| -100.0 | -100 |
| -100.0 | -100 |
| -100.0 | -100 |
| -100.0 | -100 |
| -100.0 | -100 |
| 0.40010989769182326 | 0.095 |
| -100.0 | -100 |
| 0.36249295790195635 | 0.279 |
| -100.0 | -100 |
| 0.4462859899855227 | 0.373 |
| -100.0 | -100 |
| -100.0 | -100 |
| -100.0 | -100 |
| -100.0 | -100 |
| -100.0 | -100 |
| -100.0 | -100 |
| -100.0 | -100 |
| -100.0 | -100 |
| -100.0 | -100 |
| -100.0 | -100 |
| 0.3921544671504795 | 0.055 |
| -100.0 | -100 |
| -100.0 | -100 |
| -100.0 | -100 |
| -100.0 | -100 |
| -100.0 | -100 |
| -100.0 | -100 |
| -100.0 | -100 |
| -100.0 | -100 |
| -100.0 | -100 |
| -100.0 | -100 |
| 0.4057817574067023 | 0.078 |
| -100.0 | -100 |
| -100.0 | -100 |
| -100.0 | -100 |
| -100.0 | -100 |
| -100.0 | -100 |
| -100.0 | -100 |
| -100.0 | -100 |
| -100.0 | -100 |
| -100.0 | -100 |
| -100.0 | -100 |
| -100.0 | -100 |
| -100.0 | -100 |
| -100.0 | -100 |
| -100.0 | -100 |
| -100.0 | -100 |
| -100.0 | -100 |
| -100.0 | -100 |
| -100.0 | -100 |
| -100.0 | -100 |
| -100.0 | -100 |
| -100.0 | -100 |
| -100.0 | -100 |
| -100.0 | -100 |
| -100.0 | -100 |
| -100.0 | -100 |
| -100.0 | -100 |
| -100.0 | -100 |
| -100.0 | -100 |
| -100.0 | -100 |
| -100.0 | -100 |
| -100.0 | -100 |
| -100.0 | -100 |
| -100.0 | -100 |
| -100.0 | -100 |
| -100.0 | -100 |
| -100.0 | -100 |
| 0.4178837088576305 | 0.217 |
| -100.0 | -100 |
| -100.0 | -100 |
| -100.0 | -100 |
| -100.0 | -100 |
| -100.0 | -100 |
| -100.0 | -100 |
| -100.0 | -100 |
| -100.0 | -100 |
| -100.0 | -100 |
| -100.0 | -100 |
| -100.0 | -100 |
| -100.0 | -100 |
| -100.0 | -100 |
| -100.0 | -100 |
| -100.0 | -100 |
| -100.0 | -100 |
| -100.0 | -100 |
| -100.0 | -100 |
| -100.0 | -100 |
| -100.0 | -100 |
| -100.0 | -100 |
| -100.0 | -100 |
| -100.0 | -100 |
| -100.0 | -100 |
| -100.0 | -100 |
| -100.0 | -100 |
| -100.0 | -100 |
| -100.0 | -100 |
| 0.37863097848826055 | 0.315 |
| -100.0 | -100 |
| -100.0 | -100 |
| -100.0 | -100 |
| -100.0 | -100 |
| -100.0 | -100 |
| 0.4200324488239532 | 0.236 |
| -100.0 | -100 |
| 0.374072456922639 | 0.115 |
| -100.0 | -100 |
| -100.0 | -100 |
| -100.0 | -100 |
| -100.0 | -100 |
| 0.3810029245098484 | 0.238 |
| -100.0 | -100 |
| -100.0 | -100 |
| 0.38753037168187443 | 0.235 |
| -100.0 | -100 |
| -100.0 | -100 |
| -100.0 | -100 |
| -100.0 | -100 |
| -100.0 | -100 |
| -100.0 | -100 |
| -100.0 | -100 |
| -100.0 | -100 |
| 0.39949056054101384 | 0.399 |
| -100.0 | -100 |
| -100.0 | -100 |
| -100.0 | -100 |
| -100.0 | -100 |
| -100.0 | -100 |
| -100.0 | -100 |
| -100.0 | -100 |
| -100.0 | -100 |
| -100.0 | -100 |
| -100.0 | -100 |
| -100.0 | -100 |
| -100.0 | -100 |
| -100.0 | -100 |
| 0.38244829400827496 | 0.127 |
| -100.0 | -100 |
| -100.0 | -100 |
| -100.0 | -100 |
| -100.0 | -100 |
| -100.0 | -100 |
| -100.0 | -100 |
| -100.0 | -100 |
| -100.0 | -100 |
| 0.40784564348940844 | 0.14 |
| -100.0 | -100 |
| -100.0 | -100 |
| -100.0 | -100 |
| -100.0 | -100 |
| -100.0 | -100 |
| -100.0 | -100 |
| -100.0 | -100 |
| -100.0 | -100 |
| -100.0 | -100 |
| -100.0 | -100 |
| -100.0 | -100 |
| -100.0 | -100 |
| -100.0 | -100 |
| -100.0 | -100 |
| -100.0 | -100 |
| -100.0 | -100 |
| -100.0 | -100 |
| 0.4338887578962425 | 0.205 |
| -100.0 | -100 |
| -100.0 | -100 |
| -100.0 | -100 |
| -100.0 | -100 |
| -100.0 | -100 |
| -100.0 | -100 |
| -100.0 | -100 |
| -100.0 | -100 |
| -100.0 | -100 |
| -100.0 | -100 |
| -100.0 | -100 |
| -100.0 | -100 |
| -100.0 | -100 |
| -100.0 | -100 |
| -100.0 | -100 |
| -100.0 | -100 |
| -100.0 | -100 |
| 0.3957813309667886 | 0.288 |
| -100.0 | -100 |
| -100.0 | -100 |
| -100.0 | -100 |
| -100.0 | -100 |
| 0.37508927855117835 | 0.027 |
| -100.0 | -100 |
| -100.0 | -100 |
| -100.0 | -100 |
| -100.0 | -100 |
| -100.0 | -100 |
| -100.0 | -100 |
| -100.0 | -100 |
| -100.0 | -100 |
| -100.0 | -100 |
| -100.0 | -100 |
| -100.0 | -100 |
| -100.0 | -100 |
| -100.0 | -100 |
| -100.0 | -100 |
| -100.0 | -100 |
| -100.0 | -100 |
| -100.0 | -100 |
| -100.0 | -100 |
| -100.0 | -100 |
| -100.0 | -100 |
| -100.0 | -100 |
| -100.0 | -100 |
| -100.0 | -100 |
| 0.44786020960469997 | 0.296 |
| -100.0 | -100 |
| -100.0 | -100 |
| -100.0 | -100 |
| -100.0 | -100 |
| -100.0 | -100 |
| -100.0 | -100 |
| -100.0 | -100 |
| -100.0 | -100 |
| 0.42182232404463604 | 0.06 |
| -100.0 | -100 |
| -100.0 | -100 |
| -100.0 | -100 |
| 0.4028184978121522 | 0.385 |
| -100.0 | -100 |
| -100.0 | -100 |
| -100.0 | -100 |
| -100.0 | -100 |
| -100.0 | -100 |
| -100.0 | -100 |
| -100.0 | -100 |
| 0.4064848598548325 | 0.387 |
| -100.0 | -100 |
| -100.0 | -100 |
| -100.0 | -100 |
| -100.0 | -100 |
| -100.0 | -100 |
| -100.0 | -100 |
| -100.0 | -100 |
| -100.0 | -100 |
| -100.0 | -100 |
| -100.0 | -100 |
| -100.0 | -100 |
| 0.3668705443225164 | 0.187 |
| -100.0 | -100 |
| -100.0 | -100 |
| -100.0 | -100 |
| -100.0 | -100 |
| -100.0 | -100 |
| -100.0 | -100 |
| -100.0 | -100 |
| -100.0 | -100 |
| -100.0 | -100 |
| -100.0 | -100 |
| -100.0 | -100 |
| -100.0 | -100 |
| -100.0 | -100 |
| 0.4473512463834559 | 0.444 |
| -100.0 | -100 |
| -100.0 | -100 |
| -100.0 | -100 |
| -100.0 | -100 |
| -100.0 | -100 |
| 0.41324679179838375 | 0.295 |
| -100.0 | -100 |
| -100.0 | -100 |
| -100.0 | -100 |
| -100.0 | -100 |
| -100.0 | -100 |
| -100.0 | -100 |
| -100.0 | -100 |
| -100.0 | -100 |
| -100.0 | -100 |
| -100.0 | -100 |
| -100.0 | -100 |
| -100.0 | -100 |
| -100.0 | -100 |
| -100.0 | -100 |
| -100.0 | -100 |
| -100.0 | -100 |
| 0.3824195565609825 | 0.08 |
| -100.0 | -100 |
| -100.0 | -100 |
| -100.0 | -100 |
| -100.0 | -100 |
| -100.0 | -100 |
| -100.0 | -100 |
| -100.0 | -100 |
| -100.0 | -100 |
| -100.0 | -100 |
| -100.0 | -100 |
| -100.0 | -100 |
| 0.40333373849352216 | 0.034 |
| 0.3771069234941721 | 0.302 |
| -100.0 | -100 |
| -100.0 | -100 |
| 0.40018486914282725 | 0.281 |
| -100.0 | -100 |
| 0.37473625421862844 | 0.148 |
| -100.0 | -100 |
| -100.0 | -100 |
| -100.0 | -100 |
| -100.0 | -100 |
| -100.0 | -100 |
| 0.36277597812230555 | 0.233 |
| -100.0 | -100 |
| 0.4482679995769935 | 0.128 |
| -100.0 | -100 |
| -100.0 | -100 |
| -100.0 | -100 |
| -100.0 | -100 |
| -100.0 | -100 |
| -100.0 | -100 |
| -100.0 | -100 |
| 0.4223422373081849 | 0.085 |
| -100.0 | -100 |
| -100.0 | -100 |
| -100.0 | -100 |
| -100.0 | -100 |
| -100.0 | -100 |
| -100.0 | -100 |
| -100.0 | -100 |
| -100.0 | -100 |
| -100.0 | -100 |
| -100.0 | -100 |
| -100.0 | -100 |
| -100.0 | -100 |
| -100.0 | -100 |
| -100.0 | -100 |
| -100.0 | -100 |
| -100.0 | -100 |
| -100.0 | -100 |
| -100.0 | -100 |
| -100.0 | -100 |
| 0.4071856615494892 | 0.149 |
| -100.0 | -100 |
| -100.0 | -100 |
| -100.0 | -100 |
| -100.0 | -100 |
| -100.0 | -100 |
| -100.0 | -100 |
| 0.4350669822140334 | 0.364 |
| -100.0 | -100 |
| -100.0 | -100 |
| 0.38307538041108646 | 0.001 |
| -100.0 | -100 |
| -100.0 | -100 |
| -100.0 | -100 |
| -100.0 | -100 |
| -100.0 | -100 |
| -100.0 | -100 |
| 0.4324019078189496 | 0.293 |
| -100.0 | -100 |
| -100.0 | -100 |
| -100.0 | -100 |
| -100.0 | -100 |
| -100.0 | -100 |
| -100.0 | -100 |
| -100.0 | -100 |
| -100.0 | -100 |
| -100.0 | -100 |
| -100.0 | -100 |
| -100.0 | -100 |
| -100.0 | -100 |
| -100.0 | -100 |
| -100.0 | -100 |
| -100.0 | -100 |
| -100.0 | -100 |
| -100.0 | -100 |
| -100.0 | -100 |
| -100.0 | -100 |
| -100.0 | -100 |
| -100.0 | -100 |
| -100.0 | -100 |
| -100.0 | -100 |
| -100.0 | -100 |
| -100.0 | -100 |
| -100.0 | -100 |
| -100.0 | -100 |
| -100.0 | -100 |
| 0.40925968695466153 | 0.109 |
| -100.0 | -100 |
| -100.0 | -100 |
| -100.0 | -100 |
| -100.0 | -100 |
| -100.0 | -100 |
| -100.0 | -100 |
| -100.0 | -100 |
| -100.0 | -100 |
| -100.0 | -100 |
| -100.0 | -100 |
| -100.0 | -100 |
| 0.40139474747929216 | 0.077 |
| -100.0 | -100 |
| -100.0 | -100 |
| -100.0 | -100 |
| -100.0 | -100 |
| -100.0 | -100 |
| -100.0 | -100 |
| -100.0 | -100 |
| -100.0 | -100 |
| 0.38252429625527984 | 0.192 |
| -100.0 | -100 |
| -100.0 | -100 |
| -100.0 | -100 |
| -100.0 | -100 |
| -100.0 | -100 |
| -100.0 | -100 |
| -100.0 | -100 |
| -100.0 | -100 |
| -100.0 | -100 |
| 0.41157132607125646 | 0.278 |
| -100.0 | -100 |
| -100.0 | -100 |
| -100.0 | -100 |
| 0.3838464683945513 | 0.156 |
| -100.0 | -100 |
| -100.0 | -100 |
| -100.0 | -100 |
| -100.0 | -100 |
| -100.0 | -100 |
| -100.0 | -100 |
| -100.0 | -100 |
| -100.0 | -100 |
| -100.0 | -100 |
| -100.0 | -100 |
| -100.0 | -100 |
| -100.0 | -100 |
| -100.0 | -100 |
| -100.0 | -100 |
| -100.0 | -100 |
| 0.38946577386163306 | 0.105 |
| -100.0 | -100 |
| -100.0 | -100 |
| -100.0 | -100 |
| -100.0 | -100 |
| -100.0 | -100 |
| -100.0 | -100 |
| -100.0 | -100 |
| -100.0 | -100 |
| -100.0 | -100 |
| -100.0 | -100 |
| -100.0 | -100 |
| -100.0 | -100 |
| 0.40859754197090625 | 0.1 |
| -100.0 | -100 |
| -100.0 | -100 |
| -100.0 | -100 |
| -100.0 | -100 |
| 0.4074468803182457 | 0.141 |
| -100.0 | -100 |
| -100.0 | -100 |
| -100.0 | -100 |
| -100.0 | -100 |
| -100.0 | -100 |
| -100.0 | -100 |
| -100.0 | -100 |
| -100.0 | -100 |
| -100.0 | -100 |
| -100.0 | -100 |
| -100.0 | -100 |
| -100.0 | -100 |
| -100.0 | -100 |
| -100.0 | -100 |
| -100.0 | -100 |
| -100.0 | -100 |
| -100.0 | -100 |
| -100.0 | -100 |
| 0.35835050680130054 | 0.091 |
| -100.0 | -100 |
| -100.0 | -100 |
| -100.0 | -100 |
| -100.0 | -100 |
| -100.0 | -100 |
| -100.0 | -100 |
| -100.0 | -100 |
| -100.0 | -100 |
| 0.4496344684132042 | 0.052 |
| -100.0 | -100 |
| -100.0 | -100 |
| -100.0 | -100 |
| -100.0 | -100 |
| -100.0 | -100 |
| -100.0 | -100 |
| -100.0 | -100 |
| -100.0 | -100 |
| -100.0 | -100 |
| -100.0 | -100 |
| -100.0 | -100 |
| 0.4035856285481657 | 0.242 |
| -100.0 | -100 |
| -100.0 | -100 |
| -100.0 | -100 |
| -100.0 | -100 |
| -100.0 | -100 |
| 0.38811230282912557 | 0.338 |
| -100.0 | -100 |
| -100.0 | -100 |
| -100.0 | -100 |
| -100.0 | -100 |
| -100.0 | -100 |
| -100.0 | -100 |
| 0.40913560068788546 | 0.142 |
| -100.0 | -100 |
| -100.0 | -100 |
| -100.0 | -100 |
| 0.39749791718581273 | 0.218 |
| 0.39561368888848447 | 0.027 |
| 0.38752863756388034 | 0.067 |
| -100.0 | -100 |
| -100.0 | -100 |
| -100.0 | -100 |
| 0.423621215230387 | 0.422 |
| -100.0 | -100 |
| 0.44822697665678524 | 0.068 |
| -100.0 | -100 |
| -100.0 | -100 |
| -100.0 | -100 |
| -100.0 | -100 |
| 0.3970616289907333 | 0.088 |
| -100.0 | -100 |
| 0.4125602290172744 | 0.062 |
| -100.0 | -100 |
| -100.0 | -100 |
| -100.0 | -100 |
| -100.0 | -100 |
| -100.0 | -100 |
| -100.0 | -100 |
| -100.0 | -100 |
| -100.0 | -100 |
| -100.0 | -100 |
| -100.0 | -100 |
| -100.0 | -100 |
| -100.0 | -100 |
| -100.0 | -100 |
| 0.43940368321456813 | 0.428 |
| -100.0 | -100 |
| -100.0 | -100 |
| -100.0 | -100 |
| 0.41232656043818183 | 0.362 |
| -100.0 | -100 |
| -100.0 | -100 |
| -100.0 | -100 |
| -100.0 | -100 |
| -100.0 | -100 |
| -100.0 | -100 |
| -100.0 | -100 |
| -100.0 | -100 |
| -100.0 | -100 |
| -100.0 | -100 |
| -100.0 | -100 |
| -100.0 | -100 |
| -100.0 | -100 |
| -100.0 | -100 |
| -100.0 | -100 |
| -100.0 | -100 |
| 0.3789938680573095 | 0.279 |
| -100.0 | -100 |
| -100.0 | -100 |
| -100.0 | -100 |
| -100.0 | -100 |
| -100.0 | -100 |
| -100.0 | -100 |
| -100.0 | -100 |
| -100.0 | -100 |
| 0.36214574744077543 | 0.069 |
| -100.0 | -100 |
| -100.0 | -100 |
| -100.0 | -100 |
| 0.4158744044094914 | 0.22 |
| -100.0 | -100 |
| -100.0 | -100 |
| 0.39508780580139835 | 0.165 |
| -100.0 | -100 |
| -100.0 | -100 |
| -100.0 | -100 |
| -100.0 | -100 |
| -100.0 | -100 |
| -100.0 | -100 |
| -100.0 | -100 |
| -100.0 | -100 |
| 0.3933937285123229 | 0.311 |
| -100.0 | -100 |
| -100.0 | -100 |
| -100.0 | -100 |
| -100.0 | -100 |
| -100.0 | -100 |
| 0.4014603044457732 | 0.218 |
| -100.0 | -100 |
| -100.0 | -100 |
| -100.0 | -100 |
| -100.0 | -100 |
| -100.0 | -100 |
| -100.0 | -100 |
| -100.0 | -100 |
| 0.42773038128336993 | 0.142 |
| -100.0 | -100 |
| -100.0 | -100 |
| -100.0 | -100 |
| -100.0 | -100 |
| -100.0 | -100 |
| 0.3556833546399055 | 0.173 |
| -100.0 | -100 |
| -100.0 | -100 |
| 0.4266079689609257 | 0.077 |
| -100.0 | -100 |
| 0.40910352030551855 | 0.179 |
| -100.0 | -100 |
| 0.4244464955494889 | 0.096 |
| 0.3579509629553316 | 0.34 |
| -100.0 | -100 |
| -100.0 | -100 |
| -100.0 | -100 |
| -100.0 | -100 |
| -100.0 | -100 |
| -100.0 | -100 |
| 0.39827940576352616 | 0.057 |
| -100.0 | -100 |
| -100.0 | -100 |
| -100.0 | -100 |
| -100.0 | -100 |
| -100.0 | -100 |
| -100.0 | -100 |
| -100.0 | -100 |
| -100.0 | -100 |
| -100.0 | -100 |
| 0.3561420514489554 | 0.254 |
| -100.0 | -100 |
| -100.0 | -100 |
| -100.0 | -100 |
| -100.0 | -100 |
| -100.0 | -100 |
| -100.0 | -100 |
| -100.0 | -100 |
| -100.0 | -100 |
| -100.0 | -100 |
| -100.0 | -100 |
| -100.0 | -100 |
| -100.0 | -100 |
| -100.0 | -100 |
| -100.0 | -100 |
| -100.0 | -100 |
| -100.0 | -100 |
| -100.0 | -100 |
| -100.0 | -100 |
| -100.0 | -100 |
| -100.0 | -100 |
| -100.0 | -100 |
| -100.0 | -100 |
| -100.0 | -100 |
| -100.0 | -100 |
| -100.0 | -100 |
| -100.0 | -100 |
| -100.0 | -100 |
| -100.0 | -100 |
| -100.0 | -100 |
| -100.0 | -100 |
| 0.35607360046196024 | 0.214 |
| -100.0 | -100 |
| 0.43044614137018156 | 0.112 |
| -100.0 | -100 |
| -100.0 | -100 |
| -100.0 | -100 |
| -100.0 | -100 |
| 0.4370477861624721 | 0.434 |
| -100.0 | -100 |
| -100.0 | -100 |
| -100.0 | -100 |
| -100.0 | -100 |
| -100.0 | -100 |
| -100.0 | -100 |
| -100.0 | -100 |
| -100.0 | -100 |
| -100.0 | -100 |
| 0.39420170546973154 | 0.185 |
| -100.0 | -100 |
| -100.0 | -100 |
| -100.0 | -100 |
| -100.0 | -100 |
| -100.0 | -100 |
| -100.0 | -100 |
| 0.4106525737377239 | 0.39 |
| -100.0 | -100 |
| -100.0 | -100 |
| -100.0 | -100 |
| -100.0 | -100 |
| -100.0 | -100 |
| 0.44033312863892926 | 0.075 |
| -100.0 | -100 |
| -100.0 | -100 |
| -100.0 | -100 |
| -100.0 | -100 |
| -100.0 | -100 |
| -100.0 | -100 |
| -100.0 | -100 |
| -100.0 | -100 |
| -100.0 | -100 |
| -100.0 | -100 |
| -100.0 | -100 |
| -100.0 | -100 |
| -100.0 | -100 |
| -100.0 | -100 |
| -100.0 | -100 |
| -100.0 | -100 |
| -100.0 | -100 |
| -100.0 | -100 |
| -100.0 | -100 |
| -100.0 | -100 |
| -100.0 | -100 |
| -100.0 | -100 |
| -100.0 | -100 |
| -100.0 | -100 |
| -100.0 | -100 |
| -100.0 | -100 |
| -100.0 | -100 |
| -100.0 | -100 |
| -100.0 | -100 |
| -100.0 | -100 |
| -100.0 | -100 |
| -100.0 | -100 |
| -100.0 | -100 |
| -100.0 | -100 |
| -100.0 | -100 |
| -100.0 | -100 |
| 0.40266171302839915 | 0.119 |
| -100.0 | -100 |
| -100.0 | -100 |
| -100.0 | -100 |
| -100.0 | -100 |
| 0.4269552482257031 | 0.288 |
| -100.0 | -100 |
| -100.0 | -100 |
| -100.0 | -100 |
| -100.0 | -100 |
| -100.0 | -100 |
| -100.0 | -100 |
| -100.0 | -100 |
| -100.0 | -100 |
| -100.0 | -100 |
| -100.0 | -100 |
| -100.0 | -100 |
| -100.0 | -100 |
| -100.0 | -100 |
| -100.0 | -100 |
| -100.0 | -100 |
| -100.0 | -100 |
| -100.0 | -100 |
| -100.0 | -100 |
| -100.0 | -100 |
| -100.0 | -100 |
| -100.0 | -100 |
| -100.0 | -100 |
| 0.4125845032365205 | 0.079 |
| -100.0 | -100 |
| 0.38769035790374806 | 0.281 |
| -100.0 | -100 |
| -100.0 | -100 |
| -100.0 | -100 |
| -100.0 | -100 |
| -100.0 | -100 |
| -100.0 | -100 |
| -100.0 | -100 |
| -100.0 | -100 |
| -100.0 | -100 |
| -100.0 | -100 |
| -100.0 | -100 |
| -100.0 | -100 |
| -100.0 | -100 |
| -100.0 | -100 |
| -100.0 | -100 |
| -100.0 | -100 |
| -100.0 | -100 |
| 0.42302322583750973 | 0.076 |
| 0.42636559227724846 | 0.165 |
| -100.0 | -100 |
| -100.0 | -100 |
| 0.4047470236138945 | 0.124 |
| -100.0 | -100 |
| -100.0 | -100 |
| -100.0 | -100 |
| -100.0 | -100 |
| -100.0 | -100 |
| -100.0 | -100 |
| -100.0 | -100 |
| -100.0 | -100 |
| -100.0 | -100 |
| -100.0 | -100 |
| -100.0 | -100 |
| -100.0 | -100 |
| -100.0 | -100 |
| -100.0 | -100 |
| -100.0 | -100 |
| -100.0 | -100 |
| -100.0 | -100 |
| -100.0 | -100 |
| -100.0 | -100 |
| 0.43398188284149586 | 0.244 |
| -100.0 | -100 |
| -100.0 | -100 |
| -100.0 | -100 |
| -100.0 | -100 |
| -100.0 | -100 |
| -100.0 | -100 |
| -100.0 | -100 |
| -100.0 | -100 |
| -100.0 | -100 |
| -100.0 | -100 |
| -100.0 | -100 |
| -100.0 | -100 |
| 0.39783511317299125 | 0.036 |
| -100.0 | -100 |
| 0.41572670193213523 | 0.286 |
| -100.0 | -100 |
| -100.0 | -100 |
| -100.0 | -100 |
| 0.40388956716871316 | 0.357 |
| -100.0 | -100 |
| -100.0 | -100 |
| -100.0 | -100 |
| -100.0 | -100 |
| -100.0 | -100 |
| -100.0 | -100 |
| -100.0 | -100 |
| -100.0 | -100 |
| -100.0 | -100 |
| -100.0 | -100 |
| -100.0 | -100 |
| -100.0 | -100 |
| -100.0 | -100 |
| -100.0 | -100 |
| -100.0 | -100 |
| -100.0 | -100 |
| -100.0 | -100 |
| -100.0 | -100 |
| -100.0 | -100 |
| -100.0 | -100 |
| -100.0 | -100 |
| -100.0 | -100 |
| -100.0 | -100 |
| -100.0 | -100 |
| -100.0 | -100 |
| -100.0 | -100 |
| -100.0 | -100 |
| -100.0 | -100 |
| -100.0 | -100 |
| -100.0 | -100 |
| -100.0 | -100 |
| -100.0 | -100 |
| -100.0 | -100 |
| -100.0 | -100 |
| -100.0 | -100 |
| -100.0 | -100 |
| -100.0 | -100 |
| -100.0 | -100 |
| -100.0 | -100 |
| 0.43702155299822265 | 0.352 |
| -100.0 | -100 |
| -100.0 | -100 |
| 0.3992991984075277 | 0.032 |
| -100.0 | -100 |
| -100.0 | -100 |
| -100.0 | -100 |
| -100.0 | -100 |
| -100.0 | -100 |
| -100.0 | -100 |
| -100.0 | -100 |
| -100.0 | -100 |
| -100.0 | -100 |
| -100.0 | -100 |
| -100.0 | -100 |
| -100.0 | -100 |
| -100.0 | -100 |
| -100.0 | -100 |
| -100.0 | -100 |
| -100.0 | -100 |
| -100.0 | -100 |
| -100.0 | -100 |
| -100.0 | -100 |
| -100.0 | -100 |
| -100.0 | -100 |
| -100.0 | -100 |
| 0.4485007730491968 | 0.175 |
| -100.0 | -100 |
| -100.0 | -100 |
| -100.0 | -100 |
| -100.0 | -100 |
| -100.0 | -100 |
| -100.0 | -100 |
| -100.0 | -100 |
| -100.0 | -100 |
| -100.0 | -100 |
| -100.0 | -100 |
| -100.0 | -100 |
| -100.0 | -100 |
| -100.0 | -100 |
| -100.0 | -100 |
| -100.0 | -100 |
| 0.40566946600964715 | 0.152 |
| -100.0 | -100 |
| -100.0 | -100 |
| -100.0 | -100 |
| -100.0 | -100 |
| -100.0 | -100 |
| -100.0 | -100 |
| -100.0 | -100 |
| 0.3907507936434248 | 0.035 |
| -100.0 | -100 |
| -100.0 | -100 |
| -100.0 | -100 |
| -100.0 | -100 |
| -100.0 | -100 |
| -100.0 | -100 |
| -100.0 | -100 |
| -100.0 | -100 |
| -100.0 | -100 |
| -100.0 | -100 |
| 0.3518407796226837 | 0.269 |
| -100.0 | -100 |
| -100.0 | -100 |
| -100.0 | -100 |
| -100.0 | -100 |
| -100.0 | -100 |
| -100.0 | -100 |
| -100.0 | -100 |
| 0.4376454855263432 | 0.329 |
| -100.0 | -100 |
| -100.0 | -100 |
| -100.0 | -100 |
| 0.444117971944066 | 0.315 |
| -100.0 | -100 |
| -100.0 | -100 |
| -100.0 | -100 |
| -100.0 | -100 |
| -100.0 | -100 |
| -100.0 | -100 |
| -100.0 | -100 |
| -100.0 | -100 |
| -100.0 | -100 |
| -100.0 | -100 |
| -100.0 | -100 |
| -100.0 | -100 |
| -100.0 | -100 |
| 0.43955988809072766 | 0.17 |
| -100.0 | -100 |
| -100.0 | -100 |
| -100.0 | -100 |
| -100.0 | -100 |
| -100.0 | -100 |
| -100.0 | -100 |
| -100.0 | -100 |
| -100.0 | -100 |
| -100.0 | -100 |
| -100.0 | -100 |
| -100.0 | -100 |
| -100.0 | -100 |
| -100.0 | -100 |
| -100.0 | -100 |
| -100.0 | -100 |
| -100.0 | -100 |
| -100.0 | -100 |
| -100.0 | -100 |
| -100.0 | -100 |
| -100.0 | -100 |
| -100.0 | -100 |
| -100.0 | -100 |
| -100.0 | -100 |
| -100.0 | -100 |
| -100.0 | -100 |
| -100.0 | -100 |
| -100.0 | -100 |
| -100.0 | -100 |
| -100.0 | -100 |
| -100.0 | -100 |
| -100.0 | -100 |
| -100.0 | -100 |
| -100.0 | -100 |
| -100.0 | -100 |
| -100.0 | -100 |
| -100.0 | -100 |
| -100.0 | -100 |
| -100.0 | -100 |
| -100.0 | -100 |
| -100.0 | -100 |
| -100.0 | -100 |
| -100.0 | -100 |
| -100.0 | -100 |
| -100.0 | -100 |
| -100.0 | -100 |
| -100.0 | -100 |
| -100.0 | -100 |
| -100.0 | -100 |
| -100.0 | -100 |
| -100.0 | -100 |
| -100.0 | -100 |
| -100.0 | -100 |
| -100.0 | -100 |
| -100.0 | -100 |
| -100.0 | -100 |
| -100.0 | -100 |
| 0.41761050023911594 | 0.307 |
| -100.0 | -100 |
| -100.0 | -100 |
| -100.0 | -100 |
| -100.0 | -100 |
| -100.0 | -100 |
| -100.0 | -100 |
| -100.0 | -100 |
| -100.0 | -100 |
| -100.0 | -100 |
| -100.0 | -100 |
| -100.0 | -100 |
| -100.0 | -100 |
| -100.0 | -100 |
| -100.0 | -100 |
| -100.0 | -100 |
| -100.0 | -100 |
| -100.0 | -100 |
| -100.0 | -100 |
| -100.0 | -100 |
| -100.0 | -100 |
| -100.0 | -100 |
| 0.4049605879760826 | 0.215 |
| 0.44228300820704347 | 0.094 |
| 0.40300951565416543 | 0.325 |
| -100.0 | -100 |
| -100.0 | -100 |
| -100.0 | -100 |
| -100.0 | -100 |
| -100.0 | -100 |
| -100.0 | -100 |
| -100.0 | -100 |
| -100.0 | -100 |
| -100.0 | -100 |
| -100.0 | -100 |
| -100.0 | -100 |
| 0.4149123265718808 | 0.209 |
| -100.0 | -100 |
| -100.0 | -100 |
| -100.0 | -100 |
| -100.0 | -100 |
| 0.3711795777614295 | 0.263 |
| -100.0 | -100 |
| -100.0 | -100 |
| -100.0 | -100 |
| 0.4351648408070541 | 0.073 |
| -100.0 | -100 |
| -100.0 | -100 |
| -100.0 | -100 |
| -100.0 | -100 |
| -100.0 | -100 |
| -100.0 | -100 |
| -100.0 | -100 |
| -100.0 | -100 |
| -100.0 | -100 |
| -100.0 | -100 |
| -100.0 | -100 |
| -100.0 | -100 |
| 0.42148037990337606 | 0.219 |
| -100.0 | -100 |
| -100.0 | -100 |
| -100.0 | -100 |
| 0.44595698543157836 | 0.064 |
| -100.0 | -100 |
| -100.0 | -100 |
| 0.4197668467644571 | 0.223 |
| -100.0 | -100 |
| -100.0 | -100 |
| -100.0 | -100 |
| -100.0 | -100 |
| -100.0 | -100 |
| 0.37085867499020564 | 0.273 |
| -100.0 | -100 |
| -100.0 | -100 |
| -100.0 | -100 |
| -100.0 | -100 |
| -100.0 | -100 |
| -100.0 | -100 |
| -100.0 | -100 |
| -100.0 | -100 |
| -100.0 | -100 |
| -100.0 | -100 |
| -100.0 | -100 |
| -100.0 | -100 |
| -100.0 | -100 |
| -100.0 | -100 |
| -100.0 | -100 |
| -100.0 | -100 |
| 0.42878476644581476 | 0.004 |
| -100.0 | -100 |
| 0.4420531946536994 | 0.146 |
| -100.0 | -100 |
| -100.0 | -100 |
| -100.0 | -100 |
| 0.41865691081535816 | 0.289 |
| -100.0 | -100 |
| 0.36632227768860526 | 0.096 |
| -100.0 | -100 |
| -100.0 | -100 |
| -100.0 | -100 |
| -100.0 | -100 |
| -100.0 | -100 |
| -100.0 | -100 |
| -100.0 | -100 |
| 0.3714444142401345 | 0.233 |
| -100.0 | -100 |
| -100.0 | -100 |
| -100.0 | -100 |
| -100.0 | -100 |
| -100.0 | -100 |
| 0.36940490962641914 | 0.035 |
| -100.0 | -100 |
| -100.0 | -100 |
| -100.0 | -100 |
| -100.0 | -100 |
| -100.0 | -100 |
| -100.0 | -100 |
| -100.0 | -100 |
| -100.0 | -100 |
| -100.0 | -100 |
| -100.0 | -100 |
| -100.0 | -100 |
| -100.0 | -100 |
| -100.0 | -100 |
| -100.0 | -100 |
| -100.0 | -100 |
| -100.0 | -100 |
| -100.0 | -100 |
| -100.0 | -100 |
| -100.0 | -100 |
| -100.0 | -100 |
| -100.0 | -100 |
| -100.0 | -100 |
| 0.39035786485210555 | 0.089 |
| -100.0 | -100 |
| 0.4392830104073385 | 0.091 |
| -100.0 | -100 |
| -100.0 | -100 |
| -100.0 | -100 |
| -100.0 | -100 |
| -100.0 | -100 |
| 0.39173139815881775 | 0.281 |
| -100.0 | -100 |
| -100.0 | -100 |
| -100.0 | -100 |
| -100.0 | -100 |
| -100.0 | -100 |
| -100.0 | -100 |
| -100.0 | -100 |
| -100.0 | -100 |
| -100.0 | -100 |
| -100.0 | -100 |
| 0.40295288071221547 | 0.227 |
| 0.39098801291729035 | 0.289 |
| -100.0 | -100 |
| -100.0 | -100 |
| -100.0 | -100 |
| -100.0 | -100 |
| -100.0 | -100 |
| -100.0 | -100 |
| -100.0 | -100 |
| -100.0 | -100 |
| -100.0 | -100 |
| -100.0 | -100 |
| -100.0 | -100 |
| -100.0 | -100 |
| -100.0 | -100 |
| -100.0 | -100 |
| -100.0 | -100 |
| -100.0 | -100 |
| -100.0 | -100 |
| -100.0 | -100 |
| 0.44439666414430945 | 0.181 |
| -100.0 | -100 |
| -100.0 | -100 |
| -100.0 | -100 |
| -100.0 | -100 |
| -100.0 | -100 |
| -100.0 | -100 |
| -100.0 | -100 |
| -100.0 | -100 |
| 0.4060704801481082 | 0.16 |
| -100.0 | -100 |
| -100.0 | -100 |
| -100.0 | -100 |
| -100.0 | -100 |
| -100.0 | -100 |
| -100.0 | -100 |
| -100.0 | -100 |
| -100.0 | -100 |
| -100.0 | -100 |
| -100.0 | -100 |
| -100.0 | -100 |
| 0.38350309460595533 | 0.012 |
| -100.0 | -100 |
| -100.0 | -100 |
| -100.0 | -100 |
| -100.0 | -100 |
| -100.0 | -100 |
| -100.0 | -100 |
| -100.0 | -100 |
| -100.0 | -100 |
| 0.3870052893499436 | 0.229 |
| -100.0 | -100 |
| -100.0 | -100 |
| 0.4119706189026965 | 0.306 |
| -100.0 | -100 |
| -100.0 | -100 |
| -100.0 | -100 |
| -100.0 | -100 |
| -100.0 | -100 |
| -100.0 | -100 |
| -100.0 | -100 |
| -100.0 | -100 |
| -100.0 | -100 |
| -100.0 | -100 |
| -100.0 | -100 |
| -100.0 | -100 |
| -100.0 | -100 |
| -100.0 | -100 |
| -100.0 | -100 |
| -100.0 | -100 |
| -100.0 | -100 |
| -100.0 | -100 |
| -100.0 | -100 |
| -100.0 | -100 |
| -100.0 | -100 |
| -100.0 | -100 |
| -100.0 | -100 |
| -100.0 | -100 |